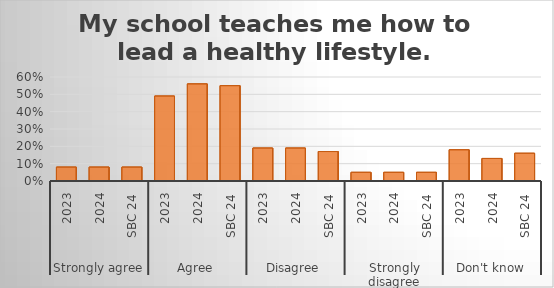
| Category | My school teaches me how to lead a healthy lifestyle. |
|---|---|
| 0 | 0.08 |
| 1 | 0.08 |
| 2 | 0.08 |
| 3 | 0.49 |
| 4 | 0.56 |
| 5 | 0.55 |
| 6 | 0.19 |
| 7 | 0.19 |
| 8 | 0.17 |
| 9 | 0.05 |
| 10 | 0.05 |
| 11 | 0.05 |
| 12 | 0.18 |
| 13 | 0.13 |
| 14 | 0.16 |